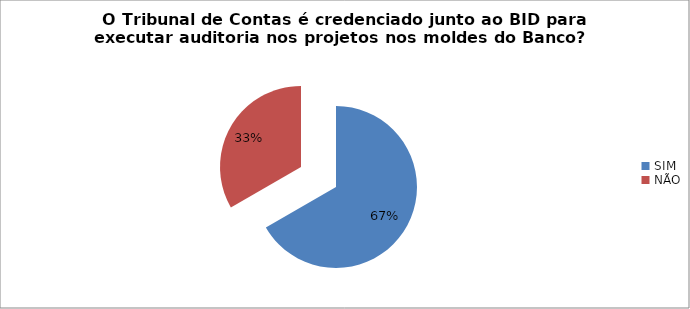
| Category | Series 0 |
|---|---|
| SIM | 0.667 |
| NÃO | 0.333 |